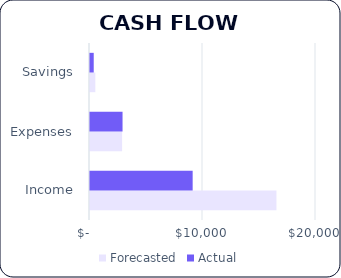
| Category | Forecasted | Actual |
|---|---|---|
| Income | 16500 | 9085 |
| Expenses | 2840 | 2880 |
| Savings | 470 | 330 |